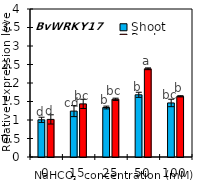
| Category | Shoot | Root |
|---|---|---|
| 0.0 | 1.005 | 1.016 |
| 15.0 | 1.24 | 1.436 |
| 25.0 | 1.337 | 1.559 |
| 50.0 | 1.681 | 2.384 |
| 100.0 | 1.461 | 1.64 |